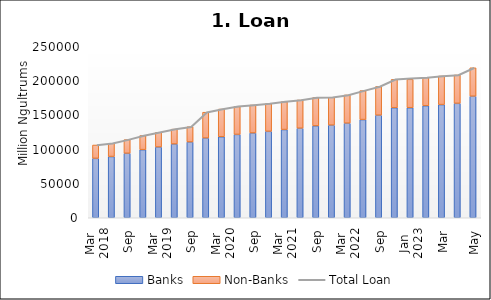
| Category | Banks | Non-Banks |
|---|---|---|
| 0 | 86839.062 | 19536.13 |
| 1 | 89492.789 | 19317.924 |
| 2 | 94257.106 | 19993.763 |
| 3 | 99542.627 | 20696.164 |
| 4 | 103455.022 | 21541.616 |
| 5 | 107823.786 | 21766.128 |
| 6 | 110793.514 | 22289.762 |
| 7 | 116541.685 | 37784.488 |
| 8 | 118433.441 | 40493.857 |
| 9 | 121831.338 | 40869.086 |
| 10 | 123947.936 | 40898.135 |
| 11 | 126363.799 | 40625.692 |
| 12 | 128951.639 | 40851.287 |
| 13 | 130897.833 | 41243.55 |
| 14 | 134359.87 | 41428.68 |
| 15 | 135415.887 | 40793.4 |
| 16 | 138284.661 | 41288.566 |
| 17 | 143532.338 | 42375.24 |
| 18 | 149966.968 | 41992.436 |
| 19 | 160873.72 | 41509.575 |
| 20 | 160873.72 | 41509.575 |
| 21 | 163784.222 | 41233.942 |
| 22 | 165428.061 | 41861.82 |
| 23 | 167303.912 | 41496.685 |
| 24 | 177685.873 | 41607.518 |